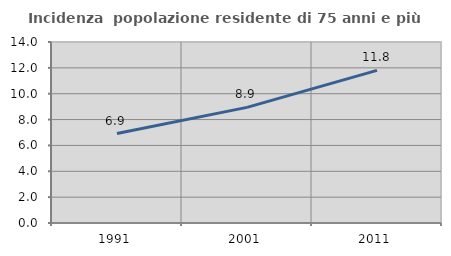
| Category | Incidenza  popolazione residente di 75 anni e più |
|---|---|
| 1991.0 | 6.917 |
| 2001.0 | 8.945 |
| 2011.0 | 11.809 |